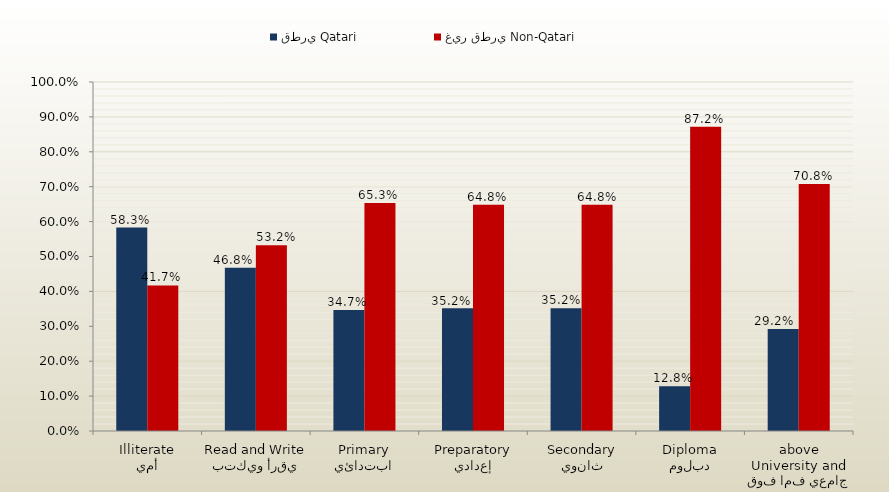
| Category | قطري Qatari | غير قطري Non-Qatari |
|---|---|---|
| أمي
Illiterate | 0.583 | 0.417 |
| يقرأ ويكتب
Read and Write | 0.468 | 0.532 |
| ابتدائي
Primary | 0.347 | 0.653 |
| إعدادي
Preparatory | 0.352 | 0.648 |
| ثانوي
Secondary | 0.352 | 0.648 |
| دبلوم
Diploma | 0.128 | 0.872 |
| جامعي فما فوق
University and above | 0.292 | 0.708 |